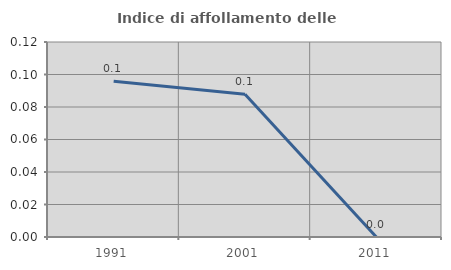
| Category | Indice di affollamento delle abitazioni  |
|---|---|
| 1991.0 | 0.096 |
| 2001.0 | 0.088 |
| 2011.0 | 0 |